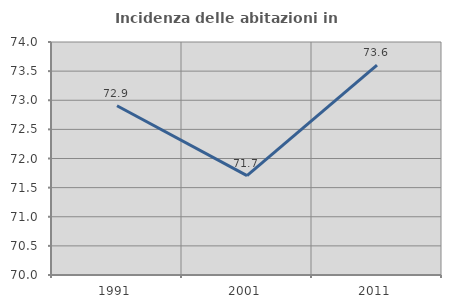
| Category | Incidenza delle abitazioni in proprietà  |
|---|---|
| 1991.0 | 72.906 |
| 2001.0 | 71.706 |
| 2011.0 | 73.604 |